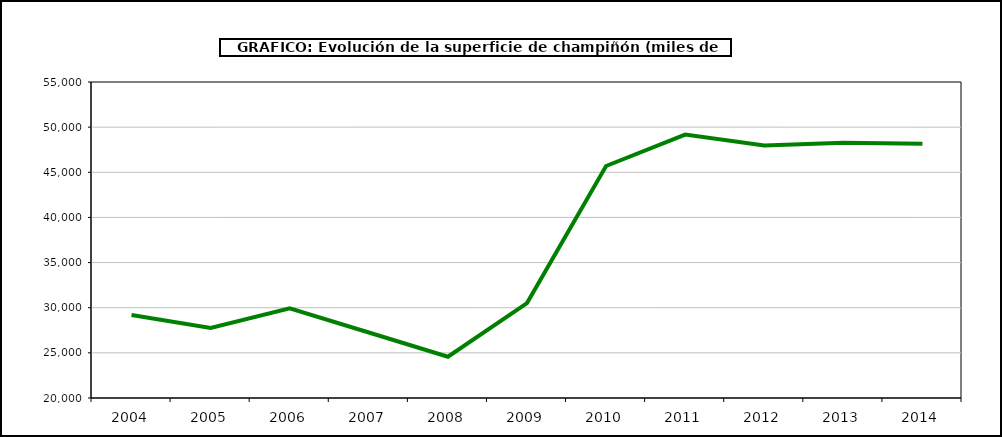
| Category | superficie |
|---|---|
| 2004.0 | 29189 |
| 2005.0 | 27747 |
| 2006.0 | 29928 |
| 2007.0 | 27253 |
| 2008.0 | 24567 |
| 2009.0 | 30509 |
| 2010.0 | 45697 |
| 2011.0 | 49173 |
| 2012.0 | 47970 |
| 2013.0 | 48261 |
| 2014.0 | 48171 |